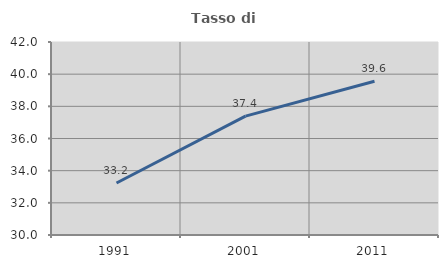
| Category | Tasso di occupazione   |
|---|---|
| 1991.0 | 33.232 |
| 2001.0 | 37.392 |
| 2011.0 | 39.56 |